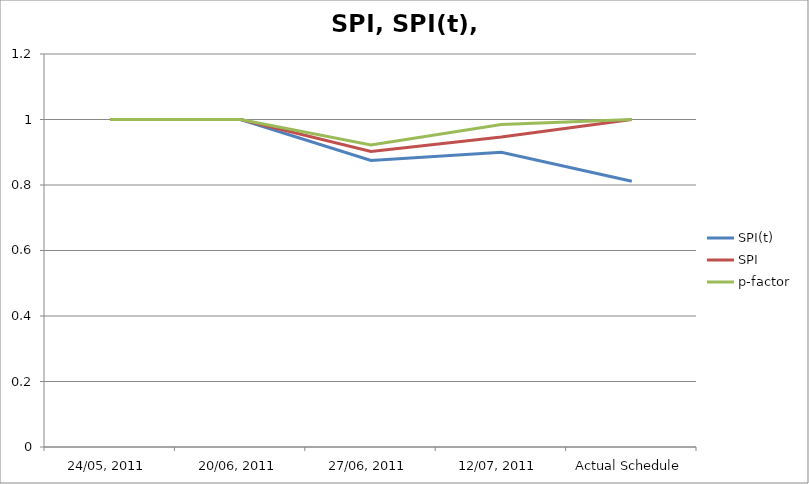
| Category | SPI(t) | SPI | p-factor |
|---|---|---|---|
| 24/05, 2011 | 1 | 1 | 1 |
| 20/06, 2011 | 1 | 1 | 1 |
| 27/06, 2011 | 0.875 | 0.902 | 0.922 |
| 12/07, 2011 | 0.9 | 0.946 | 0.985 |
| Actual Schedule | 0.811 | 1 | 1 |